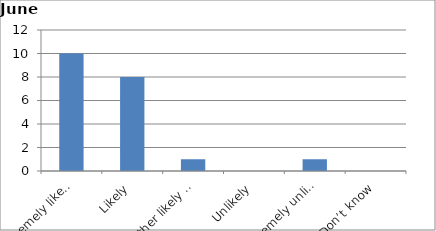
| Category | Series 0 |
|---|---|
| Extremely likely | 10 |
| Likely | 8 |
| Neither likely nor unlikely | 1 |
| Unlikely | 0 |
| Extremely unlikely | 1 |
| Don’t know | 0 |